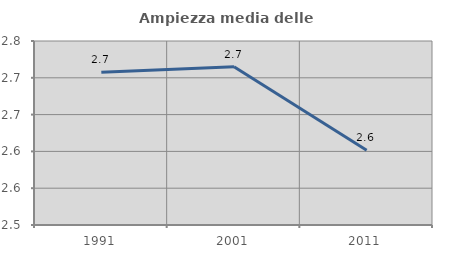
| Category | Ampiezza media delle famiglie |
|---|---|
| 1991.0 | 2.708 |
| 2001.0 | 2.715 |
| 2011.0 | 2.601 |